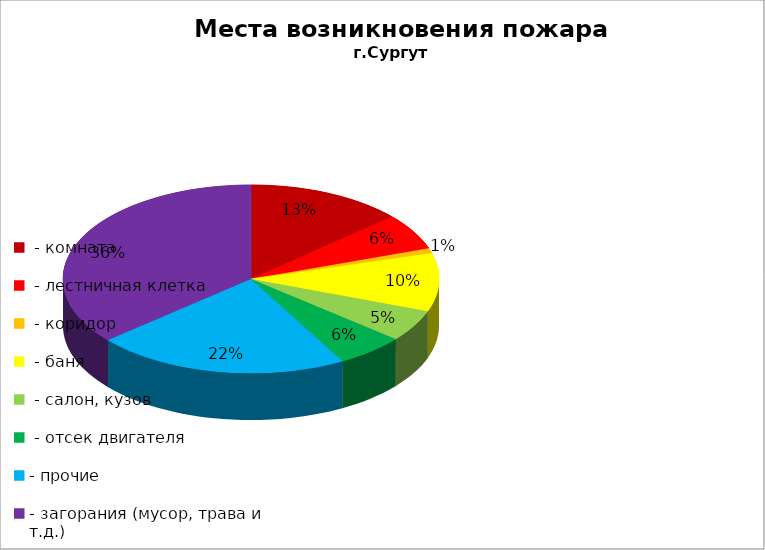
| Category | Места возникновения пожара |
|---|---|
|  - комната | 64 |
|  - лестничная клетка | 30 |
|  - коридор | 4 |
|  - баня | 48 |
|  - салон, кузов | 26 |
|  - отсек двигателя | 28 |
| - прочие | 104 |
| - загорания (мусор, трава и т.д.)  | 173 |